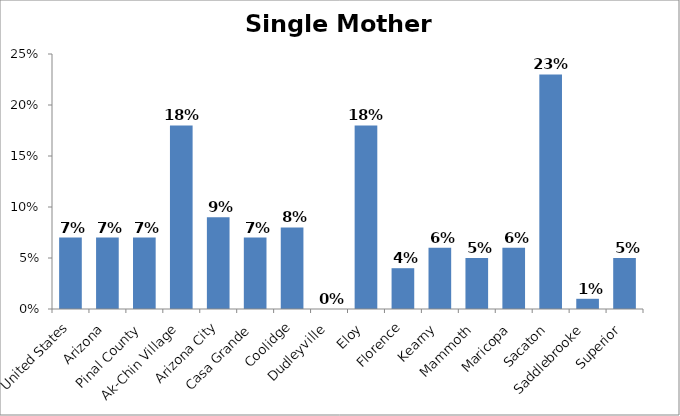
| Category | Single Mother Households |
|---|---|
| United States | 0.07 |
| Arizona | 0.07 |
| Pinal County | 0.07 |
| Ak-Chin Village | 0.18 |
| Arizona City | 0.09 |
| Casa Grande | 0.07 |
| Coolidge | 0.08 |
| Dudleyville | 0 |
| Eloy | 0.18 |
| Florence | 0.04 |
| Kearny | 0.06 |
| Mammoth | 0.05 |
| Maricopa | 0.06 |
| Sacaton | 0.23 |
| Saddlebrooke | 0.01 |
| Superior | 0.05 |